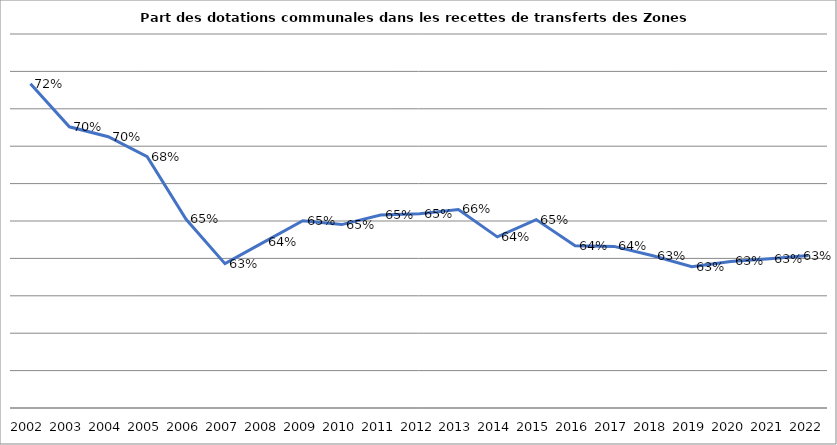
| Category | Series 0 |
|---|---|
| 2002.0 | 0.723 |
| 2003.0 | 0.7 |
| 2004.0 | 0.695 |
| 2005.0 | 0.684 |
| 2006.0 | 0.651 |
| 2007.0 | 0.627 |
| 2008.0 | 0.639 |
| 2009.0 | 0.65 |
| 2010.0 | 0.648 |
| 2011.0 | 0.653 |
| 2012.0 | 0.654 |
| 2013.0 | 0.656 |
| 2014.0 | 0.642 |
| 2015.0 | 0.651 |
| 2016.0 | 0.637 |
| 2017.0 | 0.636 |
| 2018.0 | 0.631 |
| 2019.0 | 0.626 |
| 2020.0 | 0.628 |
| 2021.0 | 0.63 |
| 2022.0 | 0.632 |